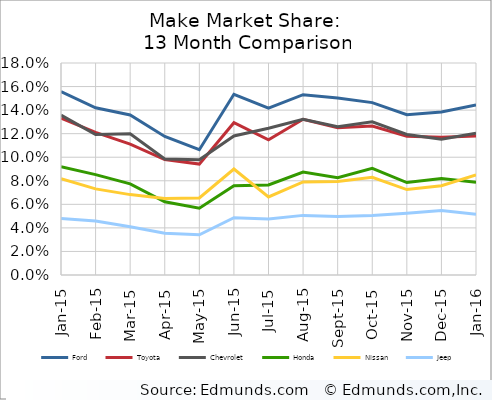
| Category | Ford | Toyota | Chevrolet | Honda | Nissan | Jeep |
|---|---|---|---|---|---|---|
| 2015-01-01 | 0.156 | 0.133 | 0.136 | 0.092 | 0.082 | 0.048 |
| 2015-02-01 | 0.142 | 0.121 | 0.119 | 0.085 | 0.073 | 0.046 |
| 2015-03-01 | 0.136 | 0.111 | 0.12 | 0.077 | 0.068 | 0.041 |
| 2015-04-01 | 0.118 | 0.098 | 0.098 | 0.062 | 0.065 | 0.035 |
| 2015-05-01 | 0.106 | 0.094 | 0.098 | 0.057 | 0.065 | 0.034 |
| 2015-06-01 | 0.153 | 0.129 | 0.118 | 0.076 | 0.09 | 0.049 |
| 2015-07-01 | 0.142 | 0.115 | 0.125 | 0.076 | 0.066 | 0.048 |
| 2015-08-01 | 0.153 | 0.132 | 0.132 | 0.087 | 0.079 | 0.051 |
| 2015-09-01 | 0.15 | 0.125 | 0.126 | 0.083 | 0.079 | 0.05 |
| 2015-10-01 | 0.146 | 0.126 | 0.13 | 0.091 | 0.083 | 0.05 |
| 2015-11-01 | 0.136 | 0.118 | 0.119 | 0.078 | 0.073 | 0.052 |
| 2015-12-01 | 0.138 | 0.117 | 0.115 | 0.082 | 0.076 | 0.055 |
| 2016-01-01 | 0.144 | 0.118 | 0.12 | 0.079 | 0.085 | 0.052 |